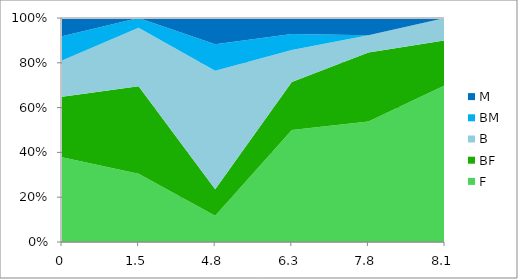
| Category | F | BF | B | BM | M |
|---|---|---|---|---|---|
| 0.0 | 37.838 | 27.027 | 16.216 | 10.811 | 8.108 |
| 1.5 | 30.435 | 39.13 | 26.087 | 4.348 | 0 |
| 4.8 | 11.765 | 11.765 | 52.941 | 11.765 | 11.765 |
| 6.3 | 50 | 21.429 | 14.286 | 7.143 | 7.143 |
| 7.8 | 53.846 | 30.769 | 7.692 | 0 | 7.692 |
| 8.1 | 70 | 20 | 10 | 0 | 0 |